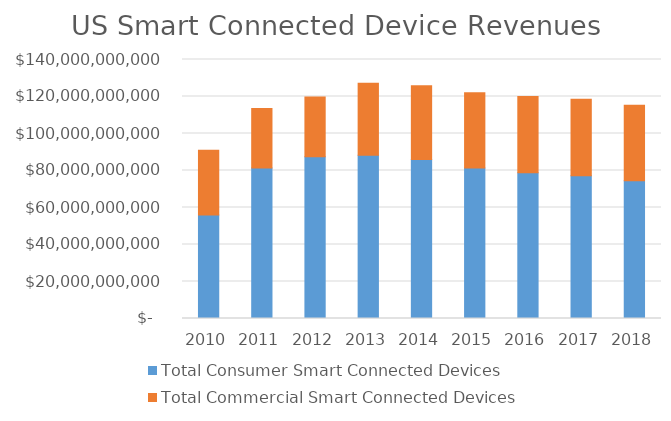
| Category | Total Consumer Smart Connected Devices | Total Commercial Smart Connected Devices |
|---|---|---|
| 2010.0 | 55916839228.96 | 34999145524.65 |
| 2011.0 | 81346571484.24 | 32197314677.73 |
| 2012.0 | 87408097472.72 | 32282293636.11 |
| 2013.0 | 88227343080.73 | 38983733740.19 |
| 2014.0 | 85983927905.33 | 39773081818.92 |
| 2015.0 | 81417806017.14 | 40628943544.9 |
| 2016.0 | 78820860493.78 | 41112839332.63 |
| 2017.0 | 77175281692.89 | 41296667661.62 |
| 2018.0 | 74400748776.33 | 40847277750.71 |